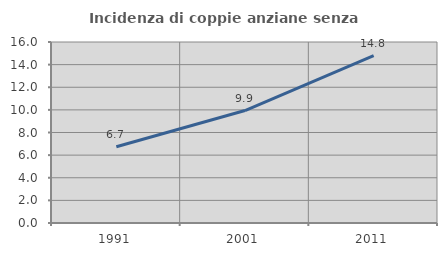
| Category | Incidenza di coppie anziane senza figli  |
|---|---|
| 1991.0 | 6.742 |
| 2001.0 | 9.939 |
| 2011.0 | 14.79 |